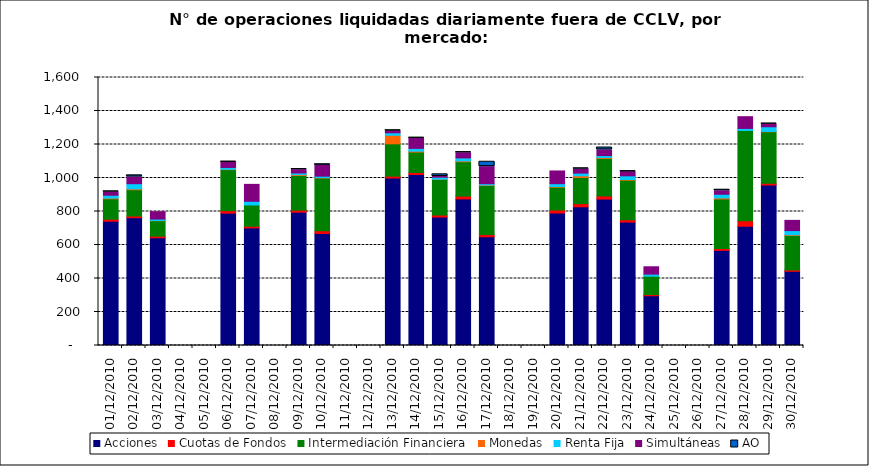
| Category | Acciones | Cuotas de Fondos | Intermediación Financiera | Monedas | Renta Fija | Simultáneas | AO |
|---|---|---|---|---|---|---|---|
| 01/12/2010 | 742 | 12 | 122 | 4 | 17 | 20 | 2 |
| 02/12/2010 | 763 | 10 | 157 | 5 | 31 | 40 | 10 |
| 03/12/2010 | 643 | 10 | 92 | 1 | 9 | 44 | 0 |
| 06/12/2010 | 790 | 15 | 245 | 2 | 11 | 32 | 1 |
| 07/12/2010 | 702 | 10 | 127 | 0 | 22 | 101 | 0 |
| 09/12/2010 | 796 | 12 | 207 | 5 | 10 | 20 | 3 |
| 10/12/2010 | 669 | 16 | 315 | 2 | 9 | 65 | 6 |
| 13/12/2010 | 1000 | 11 | 193 | 51 | 15 | 12 | 1 |
| 14/12/2010 | 1021 | 12 | 122 | 5 | 17 | 61 | 1 |
| 15/12/2010 | 767 | 12 | 213 | 1 | 12 | 4 | 13 |
| 16/12/2010 | 875 | 17 | 205 | 5 | 18 | 31 | 3 |
| 17/12/2010 | 649 | 13 | 293 | 3 | 8 | 102 | 29 |
| 20/12/2010 | 791 | 18 | 136 | 4 | 17 | 76 | 0 |
| 21/12/2010 | 828 | 19 | 156 | 10 | 16 | 25 | 3 |
| 22/12/2010 | 874 | 19 | 224 | 5 | 12 | 34 | 14 |
| 23/12/2010 | 737 | 14 | 236 | 4 | 22 | 25 | 1 |
| 24/12/2010 | 297 | 7 | 110 | 0 | 12 | 44 | 0 |
| 27/12/2010 | 568 | 11 | 296 | 6 | 22 | 21 | 6 |
| 28/12/2010 | 712 | 33 | 539 | 0 | 12 | 70 | 0 |
| 29/12/2010 | 958 | 11 | 307 | 2 | 28 | 16 | 2 |
| 30/12/2010 | 443 | 8 | 206 | 4 | 25 | 61 | 0 |